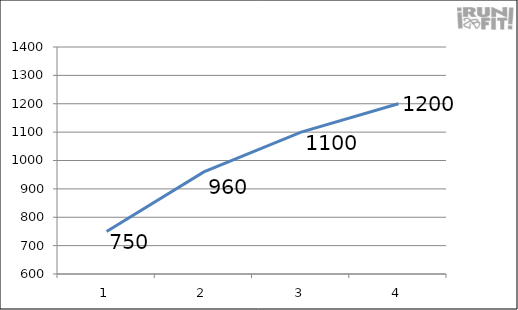
| Category | Series 0 |
|---|---|
| 0 | 750 |
| 1 | 960 |
| 2 | 1100 |
| 3 | 1200 |